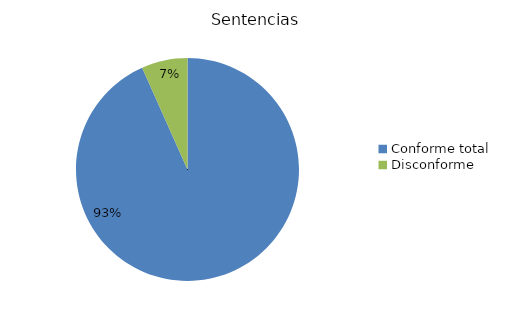
| Category | Sentencias |
|---|---|
| Conforme total | 70 |
| Conforme parcial | 0 |
| Disconforme | 5 |